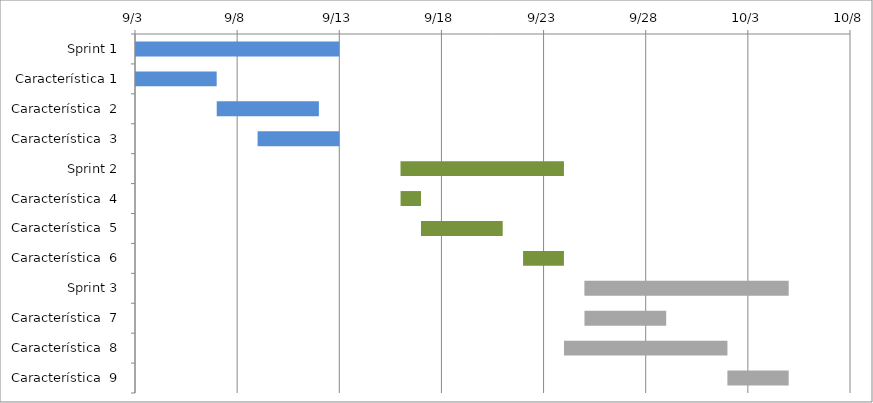
| Category | Inicio | Días |
|---|---|---|
| Sprint 1 | 2016-09-03 | 10 |
| Característica 1 | 2016-09-03 | 4 |
| Característica  2 | 2016-09-07 | 5 |
| Característica  3 | 2016-09-09 | 4 |
| Sprint 2 | 2016-09-16 | 8 |
| Característica  4 | 2016-09-16 | 1 |
| Característica  5 | 2016-09-17 | 4 |
| Característica  6 | 2016-09-22 | 2 |
| Sprint 3 | 2016-09-25 | 10 |
| Característica  7 | 2016-09-25 | 4 |
| Característica  8 | 2016-09-24 | 8 |
| Característica  9 | 2016-10-02 | 3 |